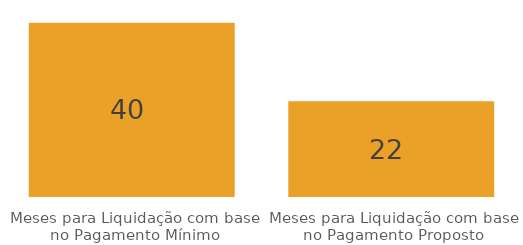
| Category | Series 0 |
|---|---|
| Meses para Liquidação com base no Pagamento Mínimo | 40 |
| Meses para Liquidação com base no Pagamento Proposto | 22 |